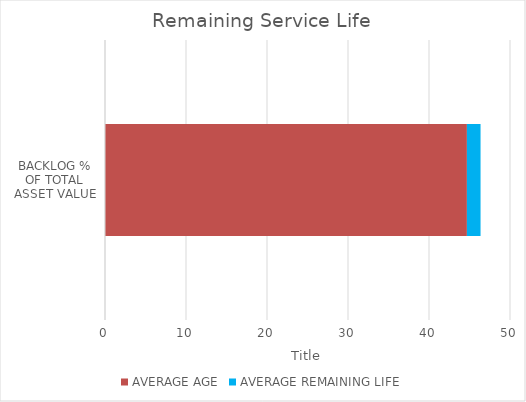
| Category | AVERAGE AGE | AVERAGE REMAINING LIFE |
|---|---|---|
| BACKLOG % OF TOTAL ASSET VALUE | 44.68 | 1.684 |